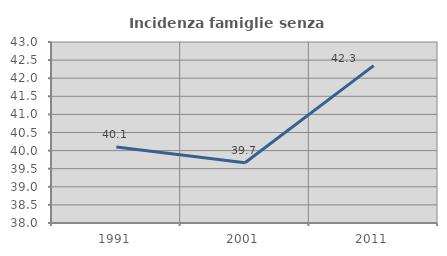
| Category | Incidenza famiglie senza nuclei |
|---|---|
| 1991.0 | 40.097 |
| 2001.0 | 39.664 |
| 2011.0 | 42.349 |